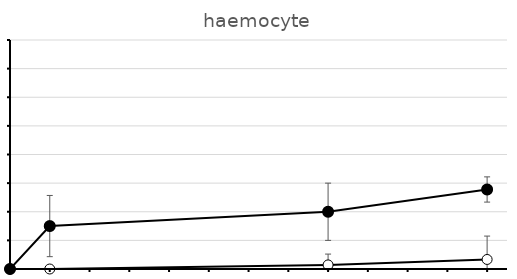
| Category | Series 0 | Series 1 |
|---|---|---|
| 0.0 | 0 | 0 |
| 2.0 | 0 | 1.5 |
| 16.0 | 0.143 | 2 |
| 24.0 | 0.333 | 2.778 |